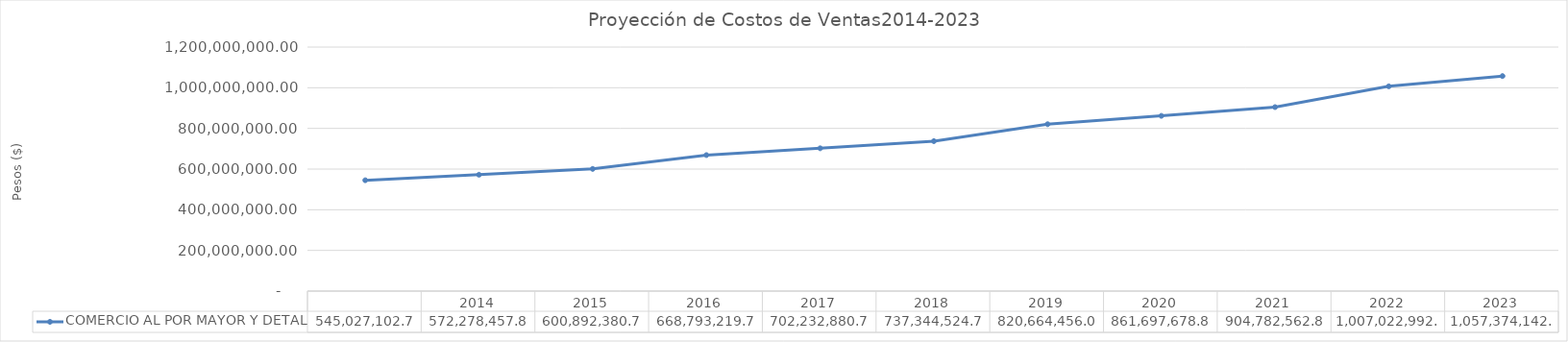
| Category | COMERCIO AL POR MAYOR Y DETAL |
|---|---|
| nan | 545027102.7 |
| 2014.0 | 572278457.835 |
| 2015.0 | 600892380.727 |
| 2016.0 | 668793219.749 |
| 2017.0 | 702232880.736 |
| 2018.0 | 737344524.773 |
| 2019.0 | 820664456.072 |
| 2020.0 | 861697678.876 |
| 2021.0 | 904782562.82 |
| 2022.0 | 1007022992.419 |
| 2023.0 | 1057374142.04 |